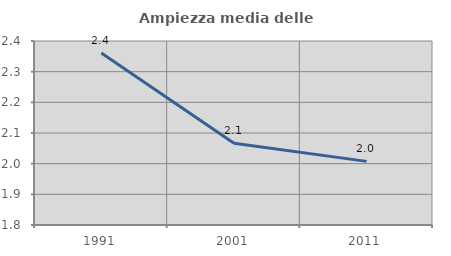
| Category | Ampiezza media delle famiglie |
|---|---|
| 1991.0 | 2.361 |
| 2001.0 | 2.066 |
| 2011.0 | 2.007 |